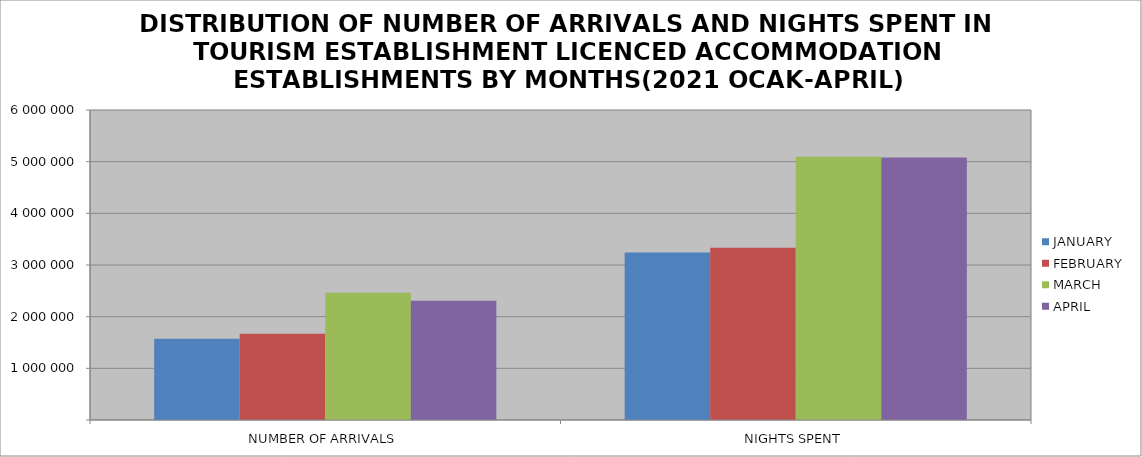
| Category | JANUARY | FEBRUARY | MARCH | APRIL |
|---|---|---|---|---|
| NUMBER OF ARRIVALS | 1571594 | 1670164 | 2462715 | 2305703 |
| NIGHTS SPENT | 3239980 | 3333484 | 5094921 | 5081446 |